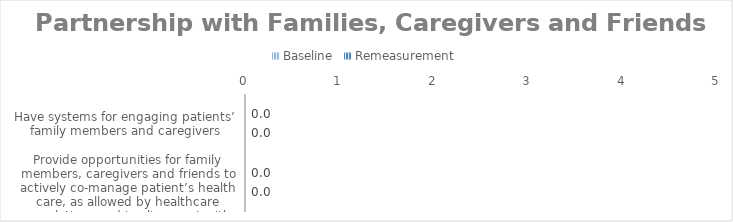
| Category | Baseline | Remeasurement |
|---|---|---|
| Have systems for engaging patients’ family members and caregivers | 0 | 0 |
| Provide opportunities for family members, caregivers and friends to actively co-manage patient’s health care, as allowed by healthcare regulations and in alignment with patients’ wishes | 0 | 0 |